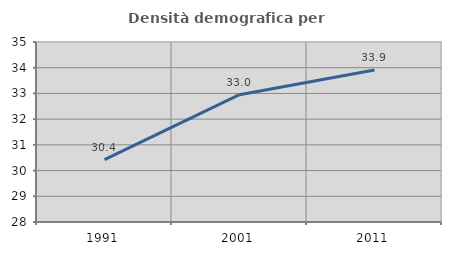
| Category | Densità demografica |
|---|---|
| 1991.0 | 30.426 |
| 2001.0 | 32.951 |
| 2011.0 | 33.913 |